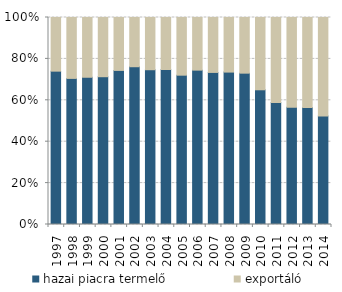
| Category | hazai piacra termelő | exportáló |
|---|---|---|
| 1997.0 | 2290 | 801 |
| 1998.0 | 2500 | 1042 |
| 1999.0 | 2760 | 1120 |
| 2000.0 | 2970 | 1190 |
| 2001.0 | 2860 | 982 |
| 2002.0 | 2740 | 855 |
| 2003.0 | 3290 | 1110 |
| 2004.0 | 3210 | 1077 |
| 2005.0 | 3650 | 1410 |
| 2006.0 | 3960 | 1350 |
| 2007.0 | 4120 | 1488 |
| 2008.0 | 4710 | 1687 |
| 2009.0 | 3100 | 1140 |
| 2010.0 | 2557 | 1372 |
| 2011.0 | 2680 | 1867 |
| 2012.0 | 2044 | 1565 |
| 2013.0 | 2297 | 1763 |
| 2014.0 | 2217 | 2013 |